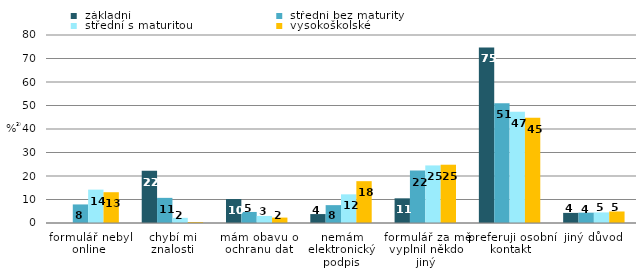
| Category |  základní |  střední bez maturity |  střední s maturitou |  vysokoškolské |
|---|---|---|---|---|
| formulář nebyl online | 0 | 7.9 | 14.2 | 13.1 |
| chybí mi znalosti | 22.2 | 10.7 | 2.2 | 0.4 |
| mám obavu o ochranu dat | 10.2 | 4.7 | 3 | 2.3 |
| nemám elektronický podpis | 3.8 | 7.6 | 12.2 | 17.8 |
| formulář za mě vyplnil někdo jiný | 10.5 | 22.3 | 24.5 | 24.8 |
| preferuji osobní kontakt | 74.7 | 51 | 47.3 | 44.8 |
| jiný důvod | 4.3 | 4.4 | 4.5 | 4.9 |